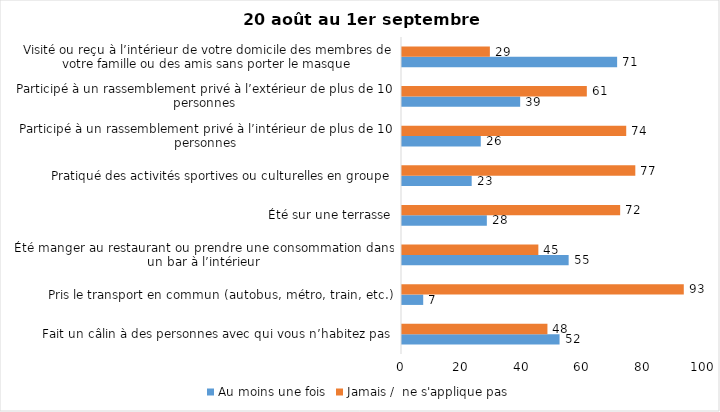
| Category | Au moins une fois | Jamais /  ne s'applique pas |
|---|---|---|
| Fait un câlin à des personnes avec qui vous n’habitez pas | 52 | 48 |
| Pris le transport en commun (autobus, métro, train, etc.) | 7 | 93 |
| Été manger au restaurant ou prendre une consommation dans un bar à l’intérieur | 55 | 45 |
| Été sur une terrasse | 28 | 72 |
| Pratiqué des activités sportives ou culturelles en groupe | 23 | 77 |
| Participé à un rassemblement privé à l’intérieur de plus de 10 personnes | 26 | 74 |
| Participé à un rassemblement privé à l’extérieur de plus de 10 personnes | 39 | 61 |
| Visité ou reçu à l’intérieur de votre domicile des membres de votre famille ou des amis sans porter le masque | 71 | 29 |